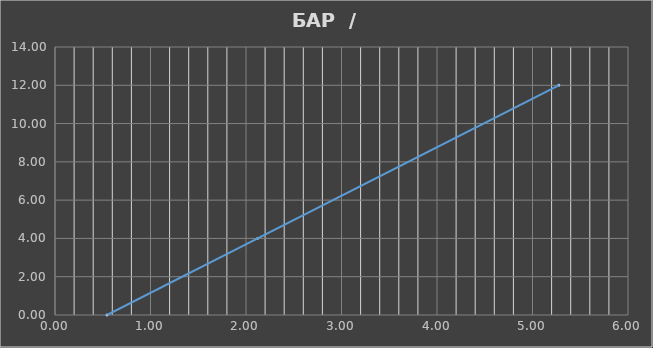
| Category | БАР |
|---|---|
| 5.274705882352944 | 12 |
| 2.1217647058823537 | 4 |
| 0.5452941176470587 | 0 |